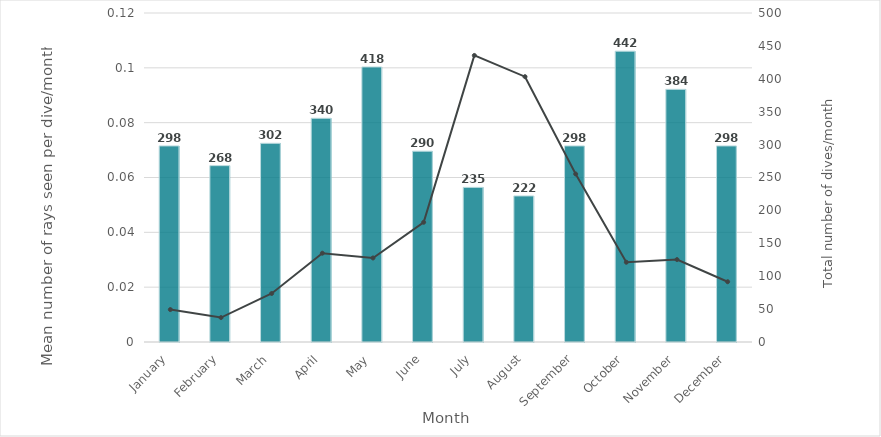
| Category | Total number of dives/month |
|---|---|
| 0 | 298 |
| 1 | 268 |
| 2 | 302 |
| 3 | 340 |
| 4 | 418 |
| 5 | 290 |
| 6 | 235 |
| 7 | 222 |
| 8 | 298 |
| 9 | 442 |
| 10 | 384 |
| 11 | 298 |